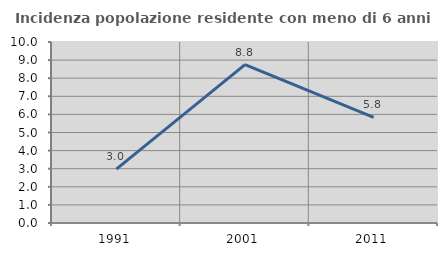
| Category | Incidenza popolazione residente con meno di 6 anni |
|---|---|
| 1991.0 | 2.979 |
| 2001.0 | 8.754 |
| 2011.0 | 5.839 |